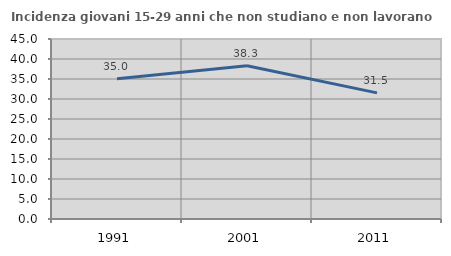
| Category | Incidenza giovani 15-29 anni che non studiano e non lavorano  |
|---|---|
| 1991.0 | 35.043 |
| 2001.0 | 38.315 |
| 2011.0 | 31.533 |